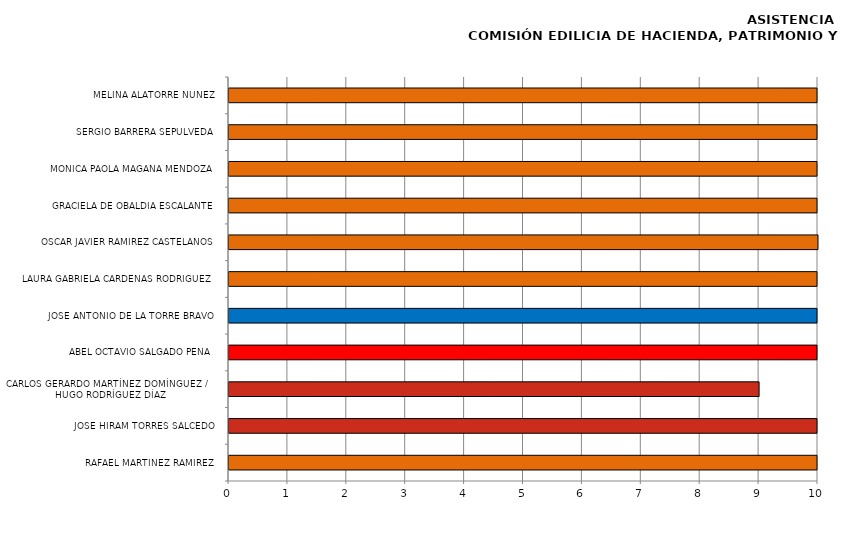
| Category | Series 0 |
|---|---|
| RAFAEL MARTÍNEZ RAMÍREZ | 12 |
| JOSÉ HIRAM TORRES SALCEDO | 11 |
| CARLOS GERARDO MARTÍNEZ DOMÍNGUEZ / 
HUGO RODRÍGUEZ DÍAZ | 9 |
| ABEL OCTAVIO SALGADO PEÑA  | 11 |
| JOSÉ ANTONIO DE LA TORRE BRAVO | 11 |
| LAURA GABRIELA CÁRDENAS RODRIGUEZ | 11 |
| OSCAR JAVIER RAMÍREZ CASTELANOS | 10 |
| GRACIELA DE OBALDÍA ESCALANTE | 12 |
| MÓNICA PAOLA MAGAÑA MENDOZA | 11 |
| SERGIO BARRERA SEPÚLVEDA | 12 |
| MELINA ALATORRE NÚÑEZ | 11 |